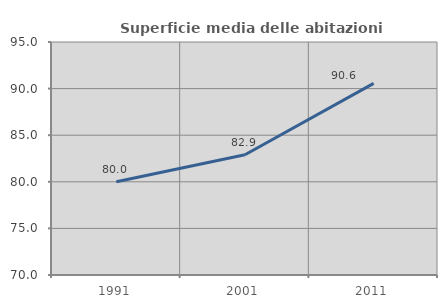
| Category | Superficie media delle abitazioni occupate |
|---|---|
| 1991.0 | 79.999 |
| 2001.0 | 82.905 |
| 2011.0 | 90.563 |